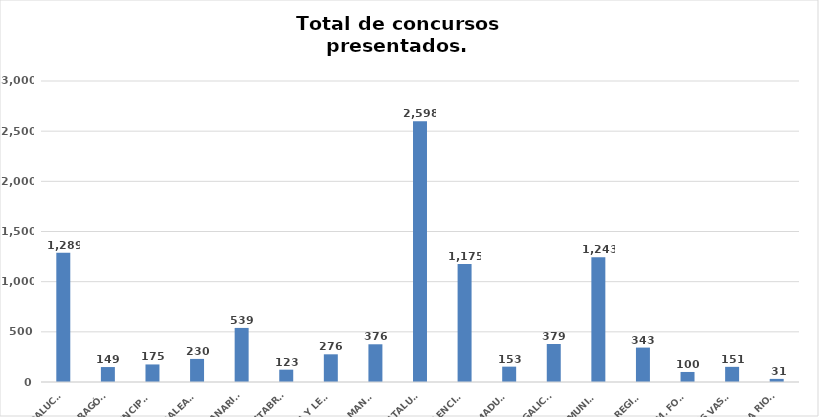
| Category | Series 0 |
|---|---|
| ANDALUCÍA | 1289 |
| ARAGÓN | 149 |
| ASTURIAS, PRINCIPADO | 175 |
| ILLES BALEARS | 230 |
| CANARIAS | 539 |
| CANTABRIA | 123 |
| CASTILLA Y LEÓN | 276 |
| CASTILLA - LA MANCHA | 376 |
| CATALUÑA | 2598 |
| COMUNITAT VALENCIANA | 1175 |
| EXTREMADURA | 153 |
| GALICIA | 379 |
| MADRID, COMUNIDAD | 1243 |
| MURCIA, REGIÓN | 343 |
| NAVARRA, COM. FORAL | 100 |
| PAÍS VASCO | 151 |
| LA RIOJA | 31 |